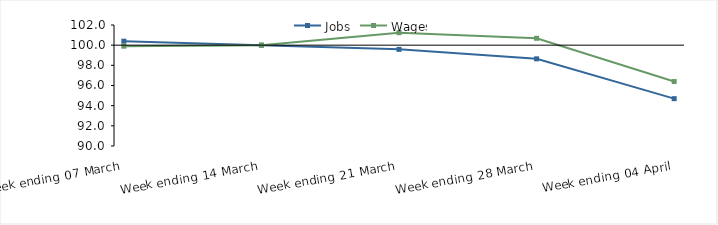
| Category | Jobs | Wages |
|---|---|---|
| 0 | 100.395 | 99.9 |
| 1900-01-01 | 100 | 100 |
| 1900-01-02 | 99.583 | 101.24 |
| 1900-01-03 | 98.645 | 100.683 |
| 1900-01-04 | 94.695 | 96.392 |